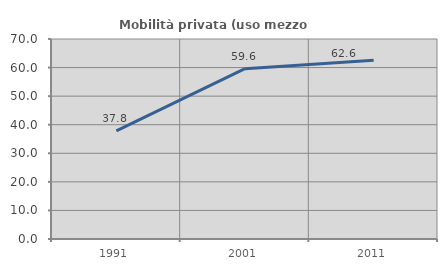
| Category | Mobilità privata (uso mezzo privato) |
|---|---|
| 1991.0 | 37.834 |
| 2001.0 | 59.615 |
| 2011.0 | 62.566 |